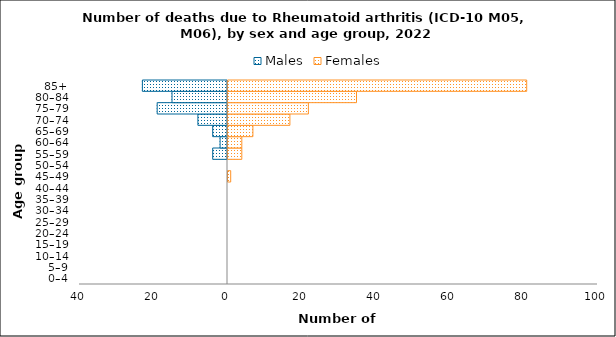
| Category | Males | Females |
|---|---|---|
| 0–4 | 0 | 0 |
| 5–9 | 0 | 0 |
| 10–14 | 0 | 0 |
| 15–19 | 0 | 0 |
| 20–24 | 0 | 0 |
| 25–29 | 0 | 0 |
| 30–34 | 0 | 0 |
| 35–39 | 0 | 0 |
| 40–44 | 0 | 0 |
| 45–49 | 0 | 1 |
| 50–54 | 0 | 0 |
| 55–59 | -4 | 4 |
| 60–64 | -2 | 4 |
| 65–69 | -4 | 7 |
| 70–74 | -8 | 17 |
| 75–79 | -19 | 22 |
| 80–84 | -15 | 35 |
| 85+ | -23 | 81 |